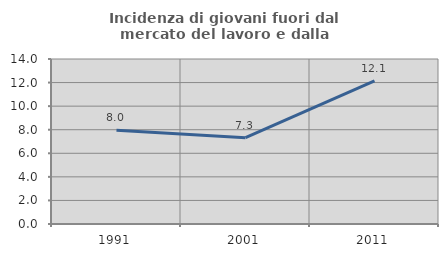
| Category | Incidenza di giovani fuori dal mercato del lavoro e dalla formazione  |
|---|---|
| 1991.0 | 7.965 |
| 2001.0 | 7.327 |
| 2011.0 | 12.137 |